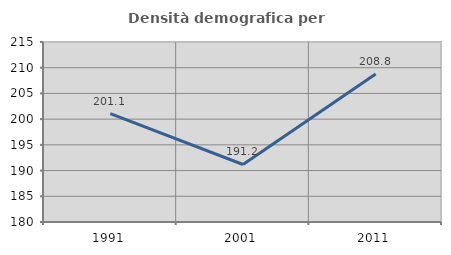
| Category | Densità demografica |
|---|---|
| 1991.0 | 201.081 |
| 2001.0 | 191.185 |
| 2011.0 | 208.799 |